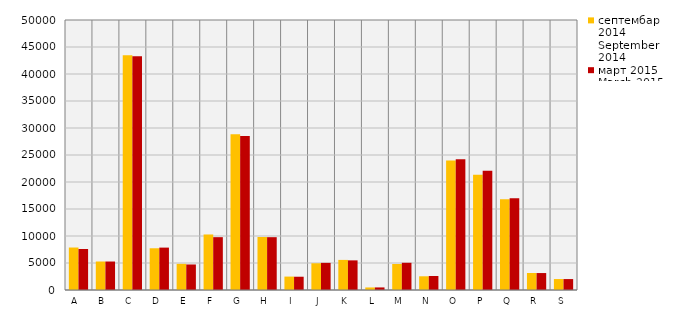
| Category | септембар 2014
September 2014 | март 2015
March 2015 |
|---|---|---|
| A  | 7866 | 7588 |
| B  | 5276 | 5274 |
| C  | 43456 | 43272 |
| D  | 7729 | 7851 |
| Е  | 4841 | 4726 |
| F  | 10282 | 9784 |
| G  | 28855 | 28512 |
| H  | 9814 | 9782 |
| I  | 2484 | 2458 |
| J  | 4949 | 5022 |
| K  | 5573 | 5487 |
| L  | 472 | 476 |
| M  | 4816 | 5039 |
| N  | 2539 | 2598 |
| O  | 23971 | 24230 |
| P  | 21351 | 22103 |
| Q  | 16793 | 17001 |
| R  | 3146 | 3139 |
| S  | 2028 | 2024 |